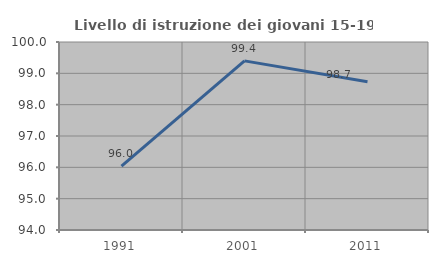
| Category | Livello di istruzione dei giovani 15-19 anni |
|---|---|
| 1991.0 | 96.037 |
| 2001.0 | 99.398 |
| 2011.0 | 98.734 |